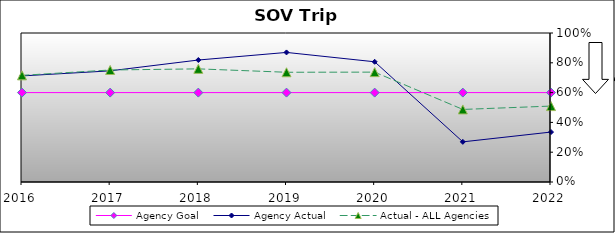
| Category | Agency Goal | Agency Actual | Actual - ALL Agencies |
|---|---|---|---|
| 2016.0 | 0.6 | 0.712 | 0.716 |
| 2017.0 | 0.6 | 0.746 | 0.752 |
| 2018.0 | 0.6 | 0.819 | 0.759 |
| 2019.0 | 0.6 | 0.87 | 0.736 |
| 2020.0 | 0.6 | 0.807 | 0.737 |
| 2021.0 | 0.6 | 0.27 | 0.487 |
| 2022.0 | 0.6 | 0.335 | 0.509 |